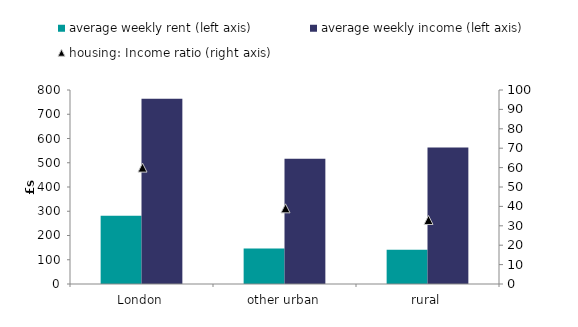
| Category | average weekly rent (left axis) | average weekly income (left axis) |
|---|---|---|
| London | 281 | 764 |
| other urban | 146 | 516 |
| rural | 141 | 563 |